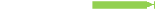
| Category | A cloud solution is available |
|---|---|
| A cloud solution is available | 2 |